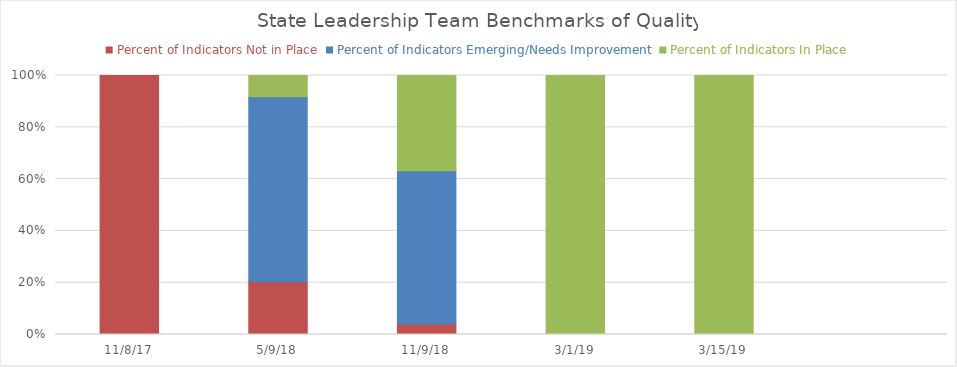
| Category | Percent of Indicators Not in Place | Percent of Indicators Emerging/Needs Improvement | Percent of Indicators In Place |
|---|---|---|---|
| 11/8/17 | 1 | 0 | 0 |
| 5/9/18 | 0.204 | 0.714 | 0.082 |
| 11/9/18 | 0.041 | 0.592 | 0.367 |
| 3/1/19 | 0 | 0 | 1 |
| 3/15/19 | 0 | 0 | 1 |